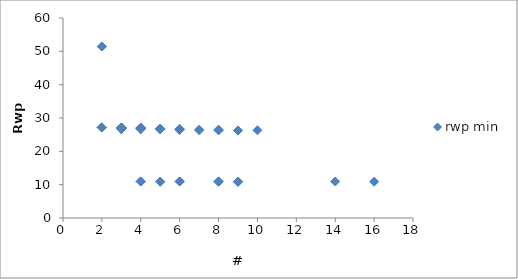
| Category | rwp min |
|---|---|
| 8.0 | 10.885 |
| 9.0 | 10.885 |
| 5.0 | 10.885 |
| 9.0 | 10.885 |
| 16.0 | 10.889 |
| 9.0 | 10.907 |
| 5.0 | 10.907 |
| 9.0 | 10.907 |
| 8.0 | 10.956 |
| 14.0 | 10.957 |
| 8.0 | 10.962 |
| 6.0 | 10.963 |
| 6.0 | 10.963 |
| 4.0 | 10.963 |
| 4.0 | 10.963 |
| 4.0 | 10.963 |
| 9.0 | 26.235 |
| 9.0 | 26.288 |
| 8.0 | 26.294 |
| 10.0 | 26.317 |
| 8.0 | 26.387 |
| 8.0 | 26.387 |
| 7.0 | 26.402 |
| 7.0 | 26.435 |
| 6.0 | 26.435 |
| 8.0 | 26.507 |
| 6.0 | 26.534 |
| 6.0 | 26.534 |
| 5.0 | 26.646 |
| 5.0 | 26.656 |
| 6.0 | 26.665 |
| 5.0 | 26.709 |
| 3.0 | 26.71 |
| 3.0 | 26.71 |
| 3.0 | 26.71 |
| 3.0 | 26.711 |
| 4.0 | 26.716 |
| 4.0 | 26.716 |
| 6.0 | 26.716 |
| 4.0 | 26.716 |
| 5.0 | 26.727 |
| 5.0 | 26.727 |
| 5.0 | 26.728 |
| 5.0 | 26.752 |
| 4.0 | 26.793 |
| 5.0 | 26.803 |
| 4.0 | 26.816 |
| 4.0 | 26.817 |
| 4.0 | 26.817 |
| 4.0 | 26.855 |
| 3.0 | 26.859 |
| 3.0 | 26.859 |
| 3.0 | 26.859 |
| 4.0 | 27.081 |
| 3.0 | 27.097 |
| 4.0 | 27.115 |
| 3.0 | 27.117 |
| 3.0 | 27.117 |
| 3.0 | 27.117 |
| 3.0 | 27.149 |
| 2.0 | 27.161 |
| 2.0 | 27.161 |
| 2.0 | 27.161 |
| 2.0 | 27.161 |
| 2.0 | 27.161 |
| 2.0 | 27.161 |
| 2.0 | 27.161 |
| 2.0 | 51.442 |
| 2.0 | 51.442 |